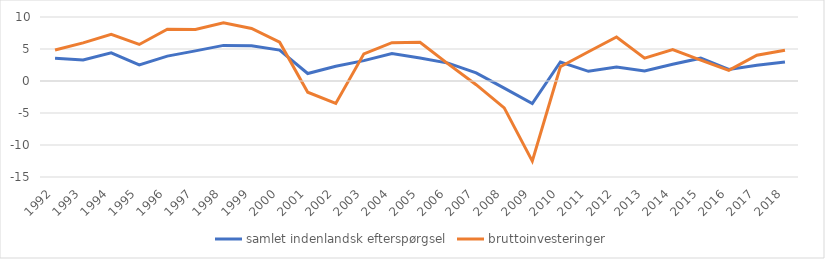
| Category | samlet indenlandsk efterspørgsel | bruttoinvesteringer |
|---|---|---|
| 1992 | 3.547 | 4.853 |
| 1993 | 3.295 | 5.964 |
| 1994 | 4.393 | 7.288 |
| 1995 | 2.529 | 5.71 |
| 1996 | 3.883 | 8.097 |
| 1997 | 4.707 | 8.048 |
| 1998 | 5.563 | 9.086 |
| 1999 | 5.518 | 8.202 |
| 2000 | 4.822 | 6.055 |
| 2001 | 1.174 | -1.749 |
| 2002 | 2.301 | -3.511 |
| 2003 | 3.18 | 4.237 |
| 2004 | 4.276 | 5.993 |
| 2005 | 3.609 | 6.059 |
| 2006 | 2.798 | 2.674 |
| 2007 | 1.279 | -0.579 |
| 2008 | -1.117 | -4.206 |
| 2009 | -3.515 | -12.522 |
| 2010 | 2.967 | 2.232 |
| 2011 | 1.51 | 4.576 |
| 2012 | 2.175 | 6.87 |
| 2013 | 1.569 | 3.568 |
| 2014 | 2.627 | 4.895 |
| 2015 | 3.569 | 3.262 |
| 2016 | 1.815 | 1.651 |
| 2017 | 2.458 | 4.024 |
| 2018 | 2.975 | 4.816 |